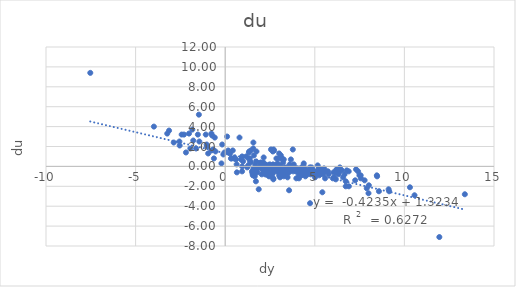
| Category | du |
|---|---|
| 0.9432142598815307 | 1 |
| -1.0349235073725427 | 2.2 |
| -0.5828532996763891 | 2.9 |
| -1.5273316105121282 | 3.2 |
| 3.7728563296203443 | 1.7 |
| 7.3033578207718275 | -0.3 |
| 10.31016190305496 | -2.1 |
| 13.37239384907627 | -2.8 |
| 10.564876919352262 | -2.9 |
| 9.149921288242213 | -2.5 |
| 7.252998354921925 | -1.4 |
| 5.468163272004611 | -0.8 |
| 5.165331710079579 | -0.4 |
| 3.5962738991806464 | -0.1 |
| 2.2373637292217197 | 0 |
| 5.364084180388229 | -0.6 |
| 6.189877102033248 | -0.4 |
| 6.781988440997866 | -0.4 |
| 5.420994313817573 | -0.5 |
| 0.5240615047921171 | 0.9 |
| -1.7819250203068182 | 2.6 |
| -2.4287768660382403 | 3.2 |
| -0.7683311027168682 | 3.3 |
| 2.728619424977574 | 1.6 |
| 6.170198707152275 | -0.6 |
| 7.780241231188367 | -1.4 |
| 8.015915391937867 | -1.9 |
| 6.579017260658704 | -1.1 |
| 3.2169536928957188 | -0.7 |
| 2.403458081833021 | -0.2 |
| 0.9479719442729406 | 0 |
| 1.9968256280694208 | -0.1 |
| 3.0497555743857596 | -0.1 |
| 1.9809816095332389 | -0.1 |
| 3.0727752848411116 | 0.1 |
| 0.3546985657322921 | 0.8 |
| -2.8722901975747894 | 2.4 |
| -2.019544786757199 | 3.3 |
| -0.7259560645533125 | 3.1 |
| 2.6573288629399228 | 1.5 |
| 7.415106238167812 | -0.5 |
| 9.118833932250613 | -2.3 |
| 6.726222850606911 | -2 |
| 4.584935628476705 | -0.8 |
| 4.92379619042107 | -0.7 |
| 2.0590973393856515 | 0.1 |
| 2.487655452956039 | 0.2 |
| 0.8851013654155082 | 0.7 |
| -0.6675232238545603 | 1.7 |
| 1.5657846818091237 | 1.8 |
| 3.0115335873595495 | 1.3 |
| 6.397498989994466 | -0.1 |
| 7.569160858836588 | -1.2 |
| 6.730272632782075 | -1.5 |
| 6.0068727611334305 | -1.2 |
| 4.3098468185995165 | -0.7 |
| 3.601109802250946 | 0.2 |
| 3.824586006509767 | 0.2 |
| 4.818697418135365 | -0.1 |
| 5.159809846807195 | 0.1 |
| 6.217339646105979 | -0.3 |
| 6.182313598326505 | -0.5 |
| 5.521285465939152 | -0.5 |
| 5.157812790498717 | -0.6 |
| 5.478300000024183 | -0.6 |
| 5.660274908434038 | -0.5 |
| 6.347484807761239 | -0.6 |
| 8.46227065873435 | -0.9 |
| 8.477019498128314 | -1 |
| 7.489340026826796 | -0.9 |
| 6.042108531485502 | -0.6 |
| 4.504402897482795 | -0.4 |
| 2.925069232407873 | -0.1 |
| 2.637737713577337 | 0 |
| 2.7387436004856935 | 0 |
| 2.6709272243796267 | 0.2 |
| 3.8448152772550426 | -0.1 |
| 5.514676233925897 | -0.2 |
| 5.335354450306062 | -0.3 |
| 4.9578561546840705 | -0.5 |
| 4.469434131486105 | -0.3 |
| 3.064780019887059 | -0.2 |
| 2.947610114439625 | 0.1 |
| 2.0442073487201062 | 0.2 |
| 0.3227914619529093 | 0.8 |
| 0.1611246078731865 | 1.4 |
| 0.42134368087578533 | 1.6 |
| -0.16735247777361906 | 2.2 |
| 2.697158764619889 | 1.7 |
| 3.1064413232145816 | 1.1 |
| 3.005276944871249 | 0.8 |
| 4.365553188952087 | 0.1 |
| 3.4725060662768703 | -0.1 |
| 5.251377703035898 | -0.2 |
| 5.378364037294192 | -0.4 |
| 6.891806086097496 | -0.5 |
| 7.561184799549903 | -0.9 |
| 6.319553786409782 | -0.8 |
| 4.7713493752379765 | -0.8 |
| 4.024055261813664 | -0.6 |
| 0.6389984128199799 | 0.2 |
| -0.20826169490241186 | 0.3 |
| -0.6290398324048763 | 0.8 |
| -1.9457634317057715 | 1.8 |
| -2.2997714710448536 | 3.2 |
| -1.8348424207727088 | 3.7 |
| 0.7986153897486803 | 2.9 |
| 2.5547951202428143 | 1.7 |
| 6.154303273356643 | -0.6 |
| 6.173984642335095 | -1.3 |
| 4.95825690072933 | -0.8 |
| 4.311515992322779 | -0.5 |
| 3.2268394403294653 | -0.2 |
| 4.465304296293993 | -0.5 |
| 5.769993106834703 | -0.8 |
| 5.013271221670101 | -1.1 |
| 4.1141118093148465 | -1.2 |
| 6.077933225596155 | -1.1 |
| 5.247033083241948 | -0.9 |
| 6.659559719611163 | -0.8 |
| 6.510448393675339 | -0.4 |
| 2.6566953584967523 | -0.3 |
| 2.389453450707335 | -0.1 |
| 1.284088156938723 | 0.1 |
| 1.420553641544986 | 0.4 |
| -0.775068743967744 | 1.6 |
| -1.623745716089553 | 1.8 |
| -0.039051531488198954 | 1.4 |
| 1.6000011986558205 | 1.1 |
| 2.9686706612209957 | 0.1 |
| 4.325718700878034 | -0.3 |
| 1.2998250196119887 | 0.8 |
| -2.190515056799669 | 1.4 |
| -1.0107452377141501 | 2 |
| -2.5560417516138023 | 2.5 |
| -1.4431837563933958 | 2.5 |
| 1.4314731652409485 | 1.6 |
| 3.268479687025838 | 0.7 |
| 5.736967079109201 | -0.5 |
| 7.899663970222681 | -2.2 |
| 8.578045114732769 | -2.5 |
| 7.996531921438144 | -2.7 |
| 6.900732226163919 | -2 |
| 5.575643773964911 | -1.2 |
| 4.5548222635726665 | -0.7 |
| 3.683987731337335 | -0.1 |
| 4.262423409248006 | -0.2 |
| 4.182460058948112 | -0.3 |
| 4.146107165729074 | -0.2 |
| 3.702004545954951 | -0.1 |
| 3.1191787285773875 | -0.2 |
| 2.9072396676214085 | -0.2 |
| 2.7115848244058993 | -0.4 |
| 3.353600672877488 | -0.9 |
| 3.2619859723208355 | -1 |
| 4.474555651430423 | -1 |
| 4.241257896544837 | -0.9 |
| 4.484493225777175 | -0.8 |
| 4.193200105129624 | -0.5 |
| 3.799338836732069 | -0.5 |
| 4.3151632099998505 | -0.5 |
| 3.7479108262349126 | -0.3 |
| 3.9075419072247097 | -0.3 |
| 2.743211930028755 | 0.1 |
| 2.821006526483294 | 0.1 |
| 2.412704964193124 | 0.1 |
| 1.7273622503686914 | 0.5 |
| 0.6030627340393391 | 0.7 |
| -0.9501973946258402 | 1.3 |
| -0.5389307958117096 | 1.5 |
| -0.10280887034219699 | 1.2 |
| 1.1664011655910578 | 1 |
| 2.858936912248855 | 0.8 |
| 3.169835814511379 | 0.8 |
| 3.6653854414522735 | 0.7 |
| 4.382645388993267 | 0.3 |
| 3.3199058070509935 | -0.3 |
| 2.806668207145946 | -0.5 |
| 2.2865117406066116 | -0.8 |
| 2.6077107599381977 | -0.8 |
| 3.430706936043171 | -0.5 |
| 4.225610689832271 | -0.9 |
| 4.337048254936149 | -0.8 |
| 4.116167021429895 | -1 |
| 3.481405627292 | -1.1 |
| 2.4023751008017014 | -0.5 |
| 2.6733258155179795 | -0.3 |
| 2.1997916299495213 | 0 |
| 2.6013098466592277 | 0 |
| 4.002379484223728 | -0.2 |
| 4.0501348871777365 | -0.4 |
| 4.421452442981133 | -0.3 |
| 4.314068944306992 | -0.3 |
| 4.31127171595187 | -0.5 |
| 4.674702492340366 | -0.4 |
| 4.483552816031211 | -0.6 |
| 4.855526883310857 | -0.6 |
| 4.09279008633523 | -0.6 |
| 4.103452727565782 | -0.4 |
| 4.883126568525764 | -0.3 |
| 4.816336792733988 | -0.3 |
| 4.721885912228041 | -0.1 |
| 4.791118246732284 | -0.3 |
| 4.8235742707329665 | -0.3 |
| 4.224744861233032 | -0.3 |
| 5.2444568111355006 | -0.4 |
| 3.9731723525519014 | -0.2 |
| 2.9055943095086967 | -0.2 |
| 2.1975051856706784 | 0.2 |
| 0.9962983270431103 | 0.5 |
| 0.48923629256110157 | 0.8 |
| 0.16731829373148877 | 1.6 |
| 1.3372586567694578 | 1.5 |
| 1.3253787532159889 | 1.4 |
| 2.1465169830615416 | 0.9 |
| 1.9925248221954739 | 0.4 |
| 1.6792570124718242 | 0.2 |
| 1.9550651524723905 | 0.3 |
| 3.2311353875128956 | 0.4 |
| 4.300440651057458 | -0.1 |
| 4.341952085996703 | -0.2 |
| 4.227491217016888 | -0.5 |
| 3.494860356231766 | -0.7 |
| 3.3511049439547858 | -0.4 |
| 3.9088432572524257 | -0.4 |
| 3.6177355801611855 | -0.5 |
| 3.448598847170792 | -0.4 |
| 2.9727366937913002 | -0.4 |
| 3.2131067957182013 | -0.6 |
| 2.9729038556202125 | -0.5 |
| 2.325277937424497 | -0.4 |
| 2.6345603763438197 | -0.6 |
| 1.5767249700146868 | -0.2 |
| 1.9343747200181172 | -0.1 |
| 2.3680360773066234 | 0.1 |
| 2.133364682457861 | 0.4 |
| 1.3924712055185307 | 0.5 |
| 1.3760107660276244 | 0.8 |
| 0.26596727212868654 | 1.3 |
| -2.5411536884212604 | 2.1 |
| -3.234227293078318 | 3.3 |
| -3.9788374053187248 | 4 |
| -3.1328157006863644 | 3.6 |
| 0.10557252348297741 | 3 |
| 1.7452658449103264 | 1.5 |
| 2.91359502911801 | 0.3 |
| 3.344209253779229 | -0.1 |
| 2.7759609093124693 | -0.4 |
| 2.037797199613345 | -0.8 |
| 1.7437088645501975 | -0.5 |
| 0.9426534645672335 | -0.5 |
| 1.543075871606514 | -0.9 |
| 2.6380693108862374 | -0.7 |
| 2.403335839137921 | -0.9 |
| 2.5737123144880414 | -1 |
| 1.551852007332477 | -0.8 |
| 1.700868485709428 | -0.6 |
| 1.5199382041070075 | -0.7 |
| 2.237022493295515 | -0.8 |
| 3.0091449601746367 | -0.9 |
| 1.6508175559380112 | -1 |
| 2.6891521587272926 | -1.3 |
| 3.059782928201682 | -1.1 |
| 2.6858351011456394 | -1.2 |
| 3.9692994988184793 | -1.2 |
| 3.2790878609270546 | -0.8 |
| 2.4473213664345517 | -1 |
| 2.119861312664817 | -0.7 |
| 1.7950168913805964 | -0.6 |
| 1.493250832714721 | -0.5 |
| 1.8057615310855146 | -0.2 |
| 2.1815663030564147 | -0.2 |
| 2.0874616941966906 | -0.3 |
| 2.3304137937582903 | -0.5 |
| 2.410821412174591 | -0.6 |
| 2.9941434967617697 | -0.6 |
| 3.328810094759116 | -0.6 |
| 3.2989628465220244 | -0.5 |
| 3.130030640718684 | -0.5 |
| 2.125110751484538 | -0.4 |
| 1.8512850454525775 | -0.1 |
| 2.1540533335291823 | -0.3 |
| 2.6702647849291328 | -0.2 |
| 3.182556070035214 | -0.2 |
| 1.2265547889679818 | -0.1 |
| -7.528460210503718 | 9.4 |
| -1.4689314767167172 | 5.2 |
| -1.0832850303525987 | 3.2 |
| 1.5726073238882199 | 2.4 |
| 11.950272211519607 | -7.1 |
| 4.735316794710931 | -3.7 |
| 5.421091782486576 | -2.6 |
| 3.5650820052708365 | -2.4 |
| 1.8705984510977824 | -2.3 |
| 1.713213136122027 | -1.5 |
| 0.6516916593409139 | -0.6 |
| 1.7179273017444263 | -0.3 |
| 2.3824681594386554 | 0 |